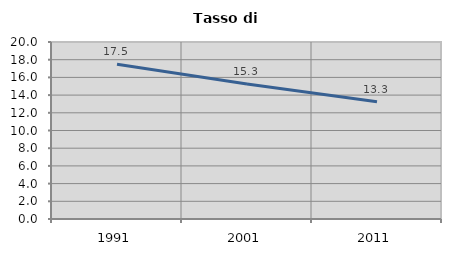
| Category | Tasso di disoccupazione   |
|---|---|
| 1991.0 | 17.48 |
| 2001.0 | 15.262 |
| 2011.0 | 13.25 |